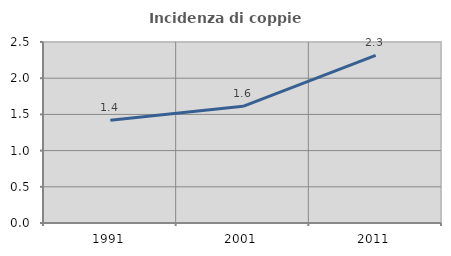
| Category | Incidenza di coppie miste |
|---|---|
| 1991.0 | 1.418 |
| 2001.0 | 1.611 |
| 2011.0 | 2.315 |